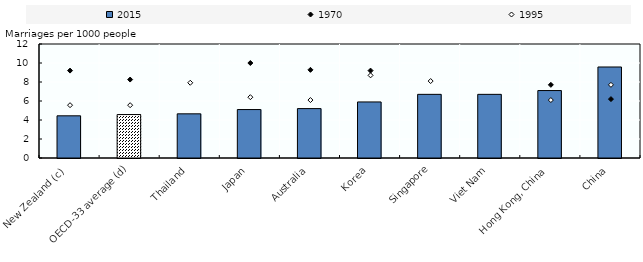
| Category | 2015 |
|---|---|
| New Zealand (c) | 4.44 |
| OECD-33 average (d) | 4.574 |
| Thailand | 4.649 |
| Japan | 5.1 |
| Australia | 5.2 |
| Korea | 5.9 |
| Singapore | 6.7 |
| Viet Nam | 6.7 |
| Hong Kong, China | 7.1 |
| China | 9.58 |